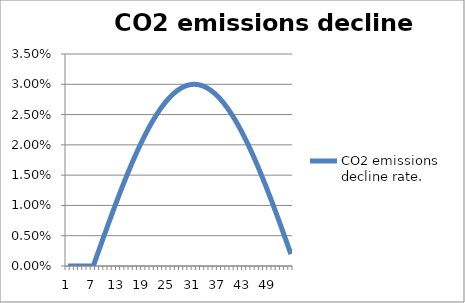
| Category | CO2 emissions decline rate.  |
|---|---|
| 0 | 0 |
| 1 | 0 |
| 2 | 0 |
| 3 | 0 |
| 4 | 0 |
| 5 | 0 |
| 6 | 0 |
| 7 | 0.002 |
| 8 | 0.004 |
| 9 | 0.006 |
| 10 | 0.008 |
| 11 | 0.01 |
| 12 | 0.011 |
| 13 | 0.013 |
| 14 | 0.015 |
| 15 | 0.017 |
| 16 | 0.018 |
| 17 | 0.02 |
| 18 | 0.021 |
| 19 | 0.023 |
| 20 | 0.024 |
| 21 | 0.025 |
| 22 | 0.026 |
| 23 | 0.027 |
| 24 | 0.028 |
| 25 | 0.028 |
| 26 | 0.029 |
| 27 | 0.029 |
| 28 | 0.03 |
| 29 | 0.03 |
| 30 | 0.03 |
| 31 | 0.03 |
| 32 | 0.03 |
| 33 | 0.029 |
| 34 | 0.029 |
| 35 | 0.028 |
| 36 | 0.028 |
| 37 | 0.027 |
| 38 | 0.026 |
| 39 | 0.025 |
| 40 | 0.024 |
| 41 | 0.023 |
| 42 | 0.021 |
| 43 | 0.02 |
| 44 | 0.018 |
| 45 | 0.017 |
| 46 | 0.015 |
| 47 | 0.013 |
| 48 | 0.011 |
| 49 | 0.01 |
| 50 | 0.008 |
| 51 | 0.006 |
| 52 | 0.004 |
| 53 | 0.002 |